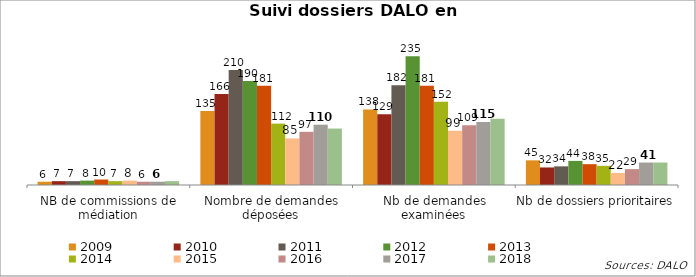
| Category | 2009 | 2010 | 2011 | 2012 | 2013 | 2014 | 2015 | 2016 | 2017 | 2018 |
|---|---|---|---|---|---|---|---|---|---|---|
| NB de commissions de médiation | 6 | 7 | 7 | 8 | 10 | 7 | 8 | 6 | 6 | 7 |
| Nombre de demandes déposées | 135 | 166 | 210 | 190 | 181 | 112 | 85 | 97 | 110 | 103 |
| Nb de demandes examinées | 138 | 129 | 182 | 235 | 181 | 152 | 99 | 109 | 115 | 121 |
| Nb de dossiers prioritaires | 45 | 32 | 34 | 44 | 38 | 35 | 22 | 29 | 41 | 41 |